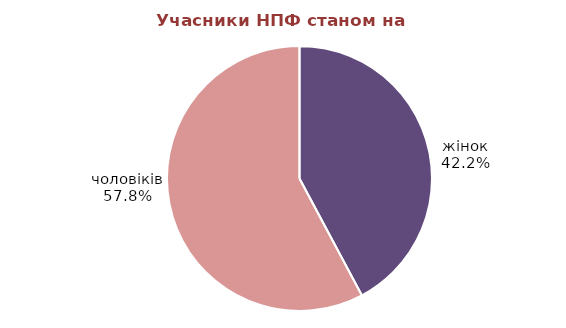
| Category | Series 0 |
|---|---|
| жінок | 368687 |
| чоловіків | 505022 |